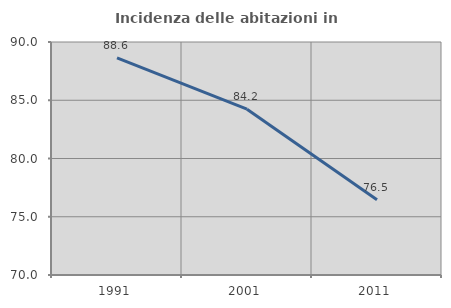
| Category | Incidenza delle abitazioni in proprietà  |
|---|---|
| 1991.0 | 88.642 |
| 2001.0 | 84.23 |
| 2011.0 | 76.458 |